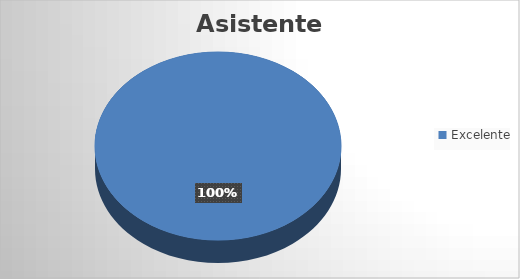
| Category | Cantidad |
|---|---|
| Excelente | 2 |